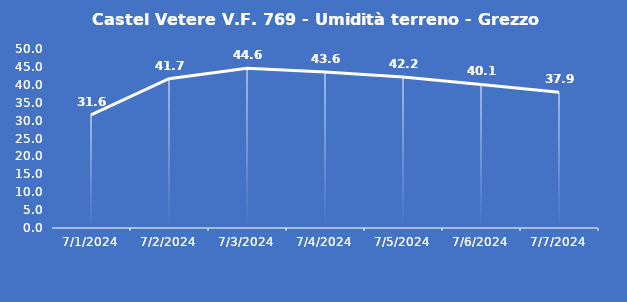
| Category | Castel Vetere V.F. 769 - Umidità terreno - Grezzo (%VWC) |
|---|---|
| 7/1/24 | 31.6 |
| 7/2/24 | 41.7 |
| 7/3/24 | 44.6 |
| 7/4/24 | 43.6 |
| 7/5/24 | 42.2 |
| 7/6/24 | 40.1 |
| 7/7/24 | 37.9 |